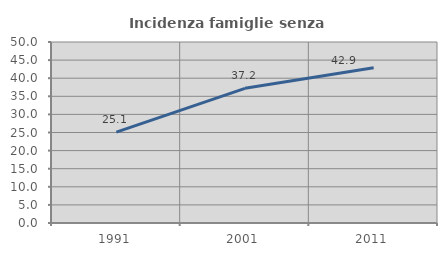
| Category | Incidenza famiglie senza nuclei |
|---|---|
| 1991.0 | 25.092 |
| 2001.0 | 37.211 |
| 2011.0 | 42.879 |